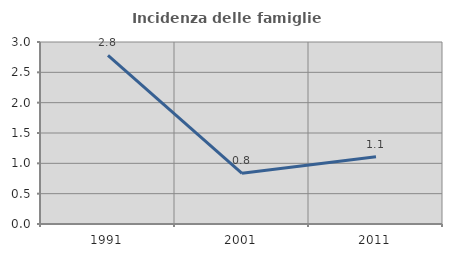
| Category | Incidenza delle famiglie numerose |
|---|---|
| 1991.0 | 2.778 |
| 2001.0 | 0.836 |
| 2011.0 | 1.107 |